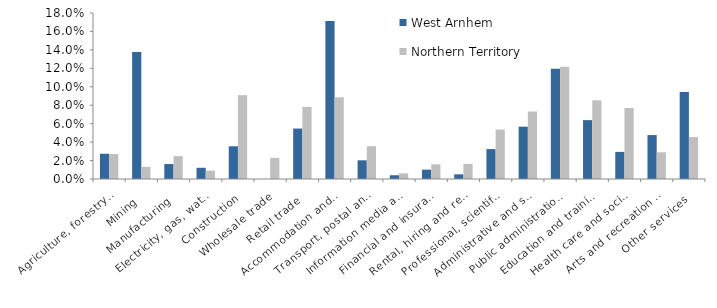
| Category | West Arnhem | Northern Territory |
|---|---|---|
| Agriculture, forestry and fishing | 0.027 | 0.027 |
| Mining | 0.138 | 0.013 |
| Manufacturing | 0.016 | 0.025 |
| Electricity, gas, water and waste services | 0.012 | 0.009 |
| Construction | 0.035 | 0.091 |
| Wholesale trade | 0 | 0.023 |
| Retail trade | 0.055 | 0.078 |
| Accommodation and food services | 0.171 | 0.089 |
| Transport, postal and warehousing | 0.02 | 0.036 |
| Information media and telecommunications | 0.004 | 0.006 |
| Financial and insurance services | 0.01 | 0.016 |
| Rental, hiring and real estate services | 0.005 | 0.016 |
| Professional, scientific and technical services | 0.032 | 0.054 |
| Administrative and support services | 0.057 | 0.073 |
| Public administration and safety | 0.12 | 0.122 |
| Education and training | 0.064 | 0.085 |
| Health care and social assistance | 0.029 | 0.077 |
| Arts and recreation services | 0.048 | 0.029 |
| Other services | 0.094 | 0.045 |